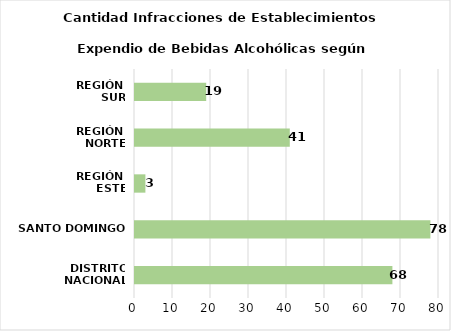
| Category | Series 0 |
|---|---|
| DISTRITO NACIONAL | 68 |
| SANTO DOMINGO | 78 |
| REGIÓN 
ESTE | 3 |
| REGIÓN 
NORTE | 41 |
| REGIÓN 
SUR | 19 |